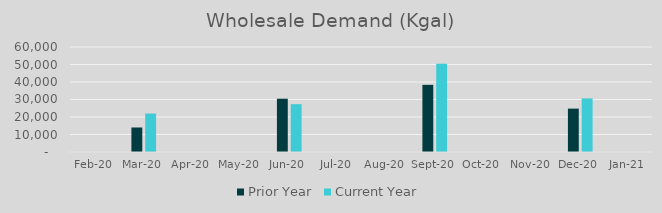
| Category | Prior Year | Current Year |
|---|---|---|
| 2020-02-01 | 0 | 0 |
| 2020-03-01 | 14013.78 | 21965.02 |
| 2020-04-01 | 0 | 0 |
| 2020-05-01 | 0 | 0 |
| 2020-06-01 | 30443.6 | 27331 |
| 2020-07-01 | 0 | 0 |
| 2020-08-01 | 0 | 0 |
| 2020-09-01 | 38376.14 | 50400.24 |
| 2020-10-01 | 0 | 0 |
| 2020-11-01 | 0 | 0 |
| 2020-12-01 | 24784.98 | 30611.9 |
| 2021-01-01 | 0 | 0 |